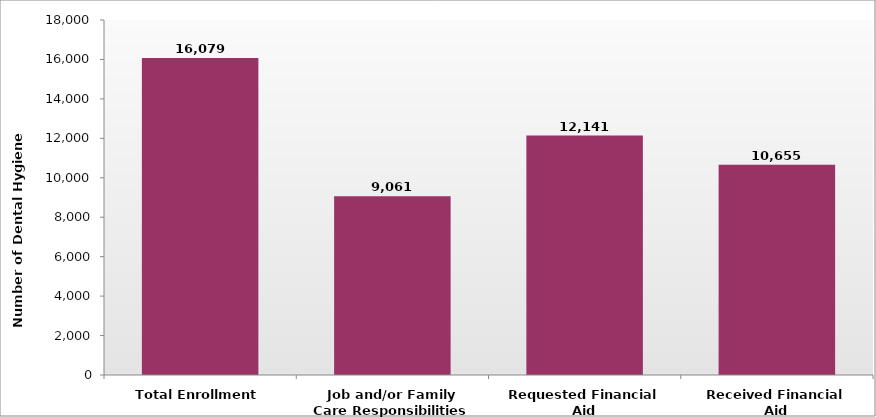
| Category | Number of Dental Hygiene Students |
|---|---|
| Total Enrollment | 16079 |
| Job and/or Family Care Responsibilities | 9061 |
| Requested Financial Aid | 12141 |
| Received Financial Aid | 10655 |